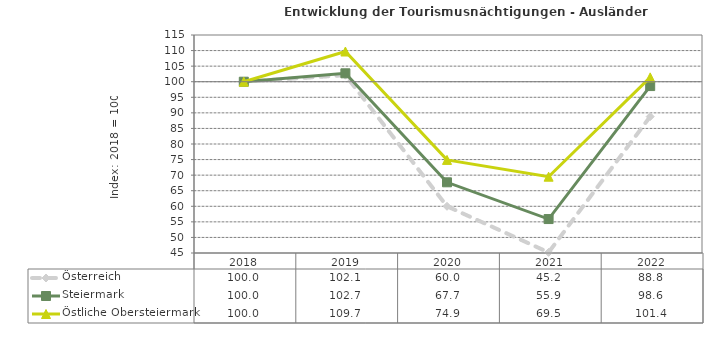
| Category | Österreich | Steiermark | Östliche Obersteiermark |
|---|---|---|---|
| 2022.0 | 88.8 | 98.6 | 101.4 |
| 2021.0 | 45.2 | 55.9 | 69.5 |
| 2020.0 | 60 | 67.7 | 74.9 |
| 2019.0 | 102.1 | 102.7 | 109.7 |
| 2018.0 | 100 | 100 | 100 |